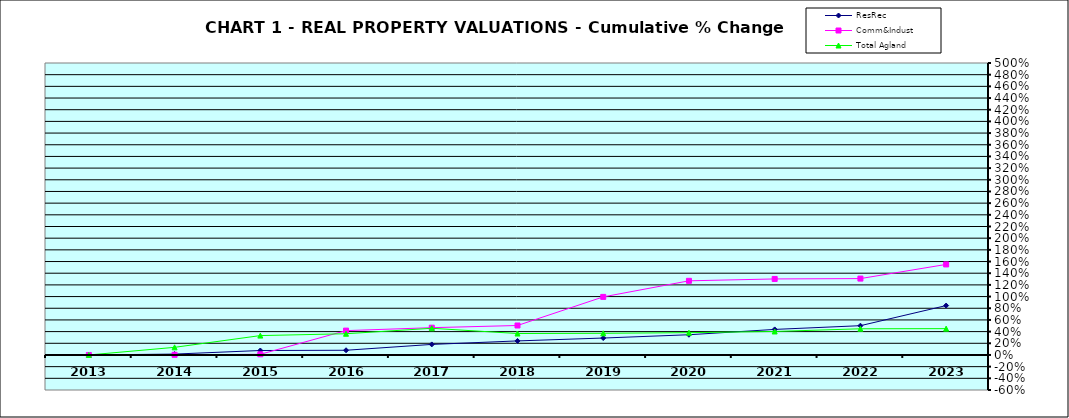
| Category | ResRec | Comm&Indust | Total Agland |
|---|---|---|---|
| 2013.0 | 0 | 0 | 0 |
| 2014.0 | 0.015 | 0.003 | 0.131 |
| 2015.0 | 0.076 | 0.011 | 0.332 |
| 2016.0 | 0.081 | 0.417 | 0.363 |
| 2017.0 | 0.181 | 0.467 | 0.457 |
| 2018.0 | 0.241 | 0.505 | 0.367 |
| 2019.0 | 0.29 | 0.994 | 0.371 |
| 2020.0 | 0.346 | 1.27 | 0.382 |
| 2021.0 | 0.437 | 1.302 | 0.402 |
| 2022.0 | 0.502 | 1.308 | 0.448 |
| 2023.0 | 0.846 | 1.55 | 0.451 |